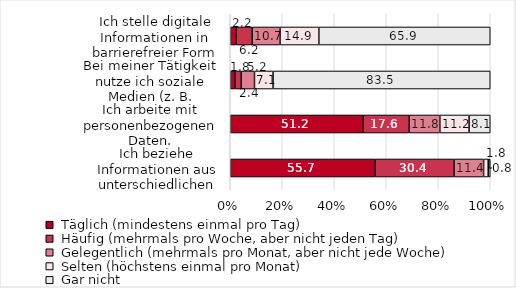
| Category | Series 0 | Series 1 | Series 2 | Series 3 | Series 4 |
|---|---|---|---|---|---|
| Ich beziehe Informationen aus unterschiedlichen digitalen Quellen. | 55.686 | 30.392 | 11.373 | 1.765 | 0.784 |
| Ich arbeite mit personenbezogenen Daten. | 51.163 | 17.636 | 11.822 | 11.24 | 8.14 |
| Bei meiner Tätigkeit nutze ich soziale Medien (z. B. Facebook, Twitter). | 1.786 | 2.381 | 5.159 | 7.143 | 83.532 |
| Ich stelle digitale Informationen in barrierefreier Form bereit. | 2.227 | 6.236 | 10.69 | 14.922 | 65.924 |